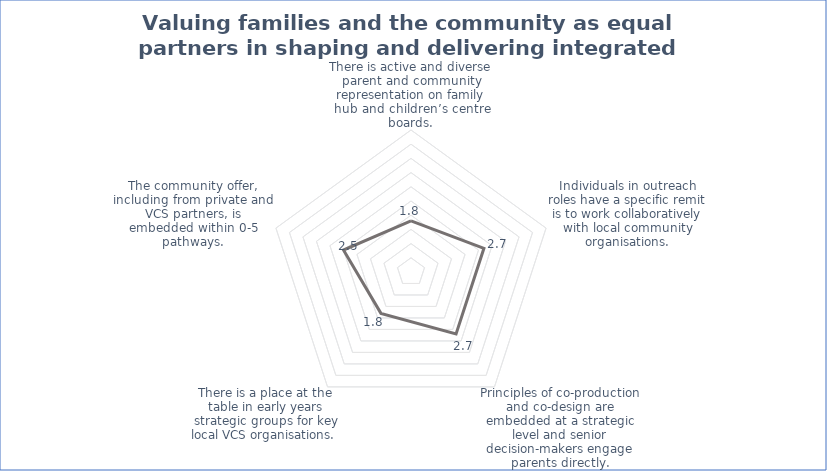
| Category | Series 0 |
|---|---|
| There is active and diverse parent and community representation on family hub and children’s centre boards. | 1.8 |
| Individuals in outreach roles have a specific remit is to work collaboratively with local community organisations. | 2.7 |
| Principles of co-production and co-design are embedded at a strategic level and senior decision-makers engage parents directly. | 2.7 |
| There is a place at the table in early years strategic groups for key local VCS organisations.  | 1.8 |
| The community offer, including from private and VCS partners, is embedded within 0-5 pathways. | 2.5 |